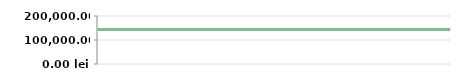
| Category | AN   |
|---|---|
| 2013-04-23 | 143800 |
| 2013-04-25 | 143800 |
| 2013-05-07 | 143800 |
| 2013-05-14 | 143800 |
| 2013-05-14 | 143800 |
| 2013-05-29 | 143800 |
| 2013-06-10 | 143800 |
| 2013-06-21 | 143800 |
| 2013-07-06 | 143800 |
| 2013-08-05 | 143800 |
| 2013-08-19 | 143800 |
| 2013-09-04 | 143800 |
| 2013-09-20 | 143800 |
| 2013-09-25 | 143800 |
| 2013-10-15 | 143800 |
| 2013-11-05 | 143800 |
| 2013-11-26 | 143800 |
| 2013-11-30 | 143800 |
| 2013-12-11 | 143800 |